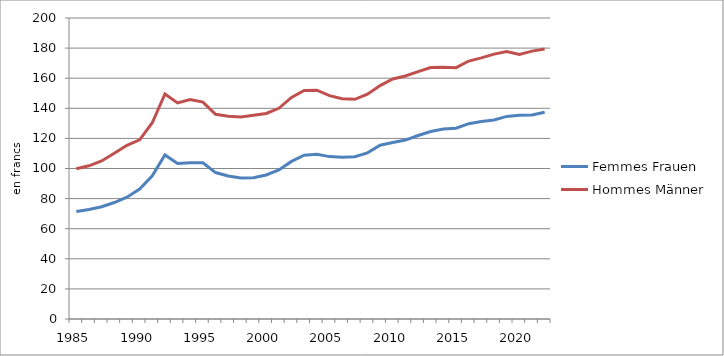
| Category | Femmes | Hommes |
|---|---|---|
| 1985.0 | 71.5 | 99.8 |
| 1986.0 | 72.7 | 101.8 |
| 1987.0 | 74.6 | 105 |
| 1988.0 | 77.4 | 110.1 |
| 1989.0 | 80.9 | 115.4 |
| 1990.0 | 86.3 | 119 |
| 1991.0 | 95.1 | 130.4 |
| 1992.0 | 109 | 149.5 |
| 1993.0 | 103.3 | 143.6 |
| 1994.0 | 103.8 | 145.8 |
| 1995.0 | 103.8 | 144.1 |
| 1996.0 | 97.3 | 136 |
| 1997.0 | 95 | 134.7 |
| 1998.0 | 93.7 | 134.3 |
| 1999.0 | 93.8 | 135.4 |
| 2000.0 | 95.7 | 136.6 |
| 2001.0 | 99 | 140 |
| 2002.0 | 104.7 | 147.2 |
| 2003.0 | 108.8 | 151.9 |
| 2004.0 | 109.4 | 152 |
| 2005.0 | 107.9 | 148.4 |
| 2006.0 | 107.4 | 146.3 |
| 2007.0 | 107.8 | 146 |
| 2008.0 | 110.4 | 149.4 |
| 2009.0 | 115.5 | 155.1 |
| 2010.0 | 117.3 | 159.5 |
| 2011.0 | 118.9 | 161.5 |
| 2012.0 | 121.9 | 164.4 |
| 2013.0 | 124.6 | 167.1 |
| 2014.0 | 126.2 | 167.2 |
| 2015.0 | 126.8 | 167 |
| 2016.0 | 129.8 | 171.4 |
| 2017.0 | 131.2 | 173.5 |
| 2018.0 | 132.2 | 176 |
| 2019.0 | 134.6 | 177.7 |
| 2020.0 | 135.3 | 175.8 |
| 2021.0 | 135.5 | 178 |
| 2022.0 | 137.4 | 179.4 |